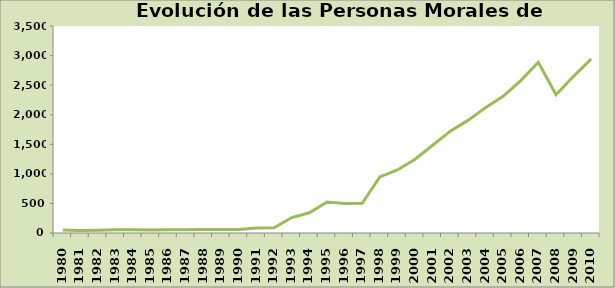
| Category | Series 0 |
|---|---|
| 1980.0 | 50 |
| 1981.0 | 44 |
| 1982.0 | 46 |
| 1983.0 | 54 |
| 1984.0 | 54 |
| 1985.0 | 51 |
| 1986.0 | 56 |
| 1987.0 | 56 |
| 1988.0 | 58 |
| 1989.0 | 60 |
| 1990.0 | 60 |
| 1991.0 | 85 |
| 1992.0 | 90 |
| 1993.0 | 261 |
| 1994.0 | 342 |
| 1995.0 | 523 |
| 1996.0 | 498 |
| 1997.0 | 503 |
| 1998.0 | 948 |
| 1999.0 | 1065 |
| 2000.0 | 1248 |
| 2001.0 | 1483 |
| 2002.0 | 1722 |
| 2003.0 | 1904 |
| 2004.0 | 2120 |
| 2005.0 | 2311 |
| 2006.0 | 2577 |
| 2007.0 | 2888 |
| 2008.0 | 2338 |
| 2009.0 | 2649 |
| 2010.0 | 2942 |